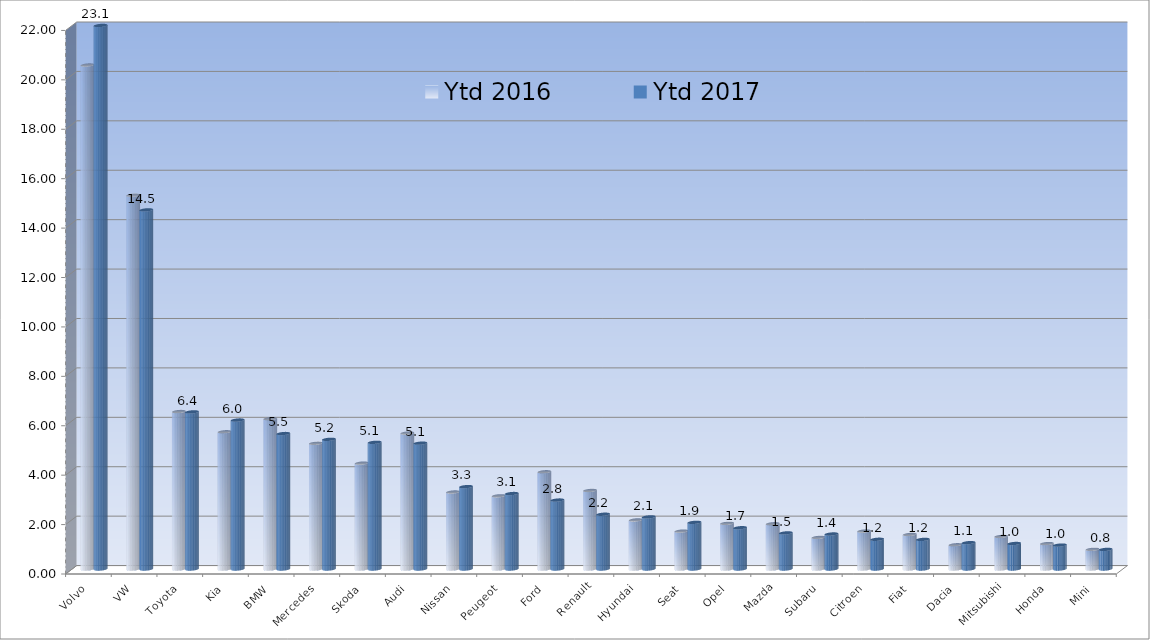
| Category | Ytd 2016 | Ytd 2017 |
|---|---|---|
| Volvo | 20.398 | 23.071 |
| VW | 15.128 | 14.535 |
| Toyota | 6.373 | 6.358 |
| Kia | 5.555 | 6.029 |
| BMW | 6.083 | 5.482 |
| Mercedes | 5.088 | 5.248 |
| Skoda | 4.285 | 5.127 |
| Audi | 5.502 | 5.093 |
| Nissan | 3.116 | 3.334 |
| Peugeot | 2.962 | 3.054 |
| Ford | 3.935 | 2.791 |
| Renault | 3.179 | 2.216 |
| Hyundai | 1.985 | 2.109 |
| Seat | 1.533 | 1.888 |
| Opel | 1.848 | 1.671 |
| Mazda | 1.831 | 1.461 |
| Subaru | 1.278 | 1.417 |
| Citroen | 1.536 | 1.203 |
| Fiat | 1.398 | 1.198 |
| Dacia | 0.981 | 1.066 |
| Mitsubishi | 1.318 | 1.032 |
| Honda | 1.028 | 0.968 |
| Mini | 0.796 | 0.793 |